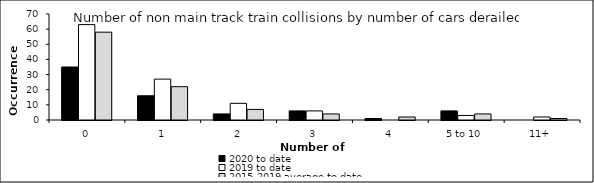
| Category | 2020 to date | 2019 to date | 2015-2019 average to date |
|---|---|---|---|
| 0 | 35 | 63 | 58 |
| 1 | 16 | 27 | 22 |
| 2 | 4 | 11 | 7 |
| 3 | 6 | 6 | 4 |
| 4 | 1 | 0 | 2 |
| 5 to 10 | 6 | 3 | 4 |
| 11+ | 0 | 2 | 1 |